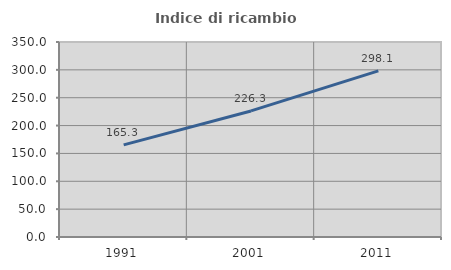
| Category | Indice di ricambio occupazionale  |
|---|---|
| 1991.0 | 165.337 |
| 2001.0 | 226.263 |
| 2011.0 | 298.065 |